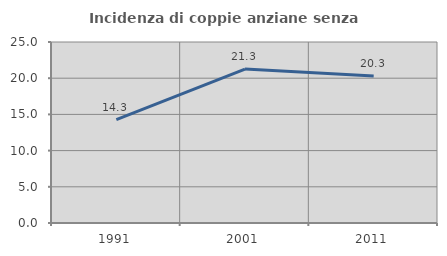
| Category | Incidenza di coppie anziane senza figli  |
|---|---|
| 1991.0 | 14.286 |
| 2001.0 | 21.257 |
| 2011.0 | 20.294 |